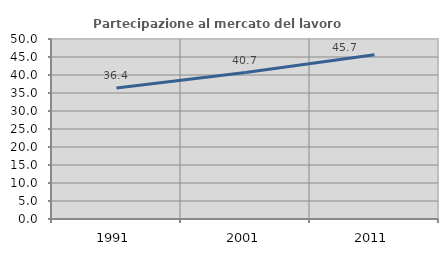
| Category | Partecipazione al mercato del lavoro  femminile |
|---|---|
| 1991.0 | 36.394 |
| 2001.0 | 40.685 |
| 2011.0 | 45.655 |